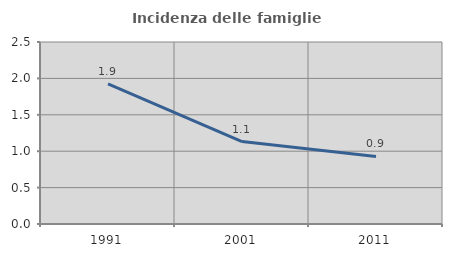
| Category | Incidenza delle famiglie numerose |
|---|---|
| 1991.0 | 1.926 |
| 2001.0 | 1.132 |
| 2011.0 | 0.929 |